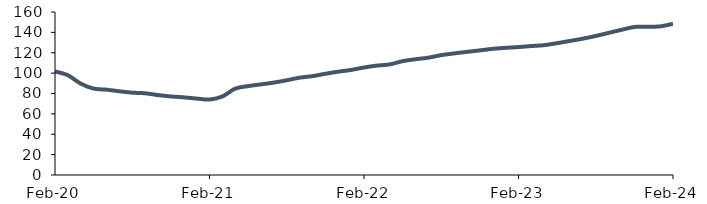
| Category | Series 0 |
|---|---|
| 2020-02-01 | 101.62 |
| 2020-03-01 | 97.938 |
| 2020-04-01 | 89.65 |
| 2020-05-01 | 84.839 |
| 2020-06-01 | 83.781 |
| 2020-07-01 | 82.182 |
| 2020-08-01 | 80.808 |
| 2020-09-01 | 80.198 |
| 2020-10-01 | 78.439 |
| 2020-11-01 | 77.102 |
| 2020-12-01 | 76.237 |
| 2021-01-01 | 75.045 |
| 2021-02-01 | 74.096 |
| 2021-03-01 | 77.079 |
| 2021-04-01 | 84.788 |
| 2021-05-01 | 87.267 |
| 2021-06-01 | 88.947 |
| 2021-07-01 | 90.706 |
| 2021-08-01 | 93 |
| 2021-09-01 | 95.533 |
| 2021-10-01 | 97.064 |
| 2021-11-01 | 99.379 |
| 2021-12-01 | 101.416 |
| 2022-01-01 | 103.119 |
| 2022-02-01 | 105.529 |
| 2022-03-01 | 107.371 |
| 2022-04-01 | 108.553 |
| 2022-05-01 | 111.761 |
| 2022-06-01 | 113.626 |
| 2022-07-01 | 115.177 |
| 2022-08-01 | 117.668 |
| 2022-09-01 | 119.358 |
| 2022-10-01 | 120.89 |
| 2022-11-01 | 122.346 |
| 2022-12-01 | 123.861 |
| 2023-01-01 | 124.823 |
| 2023-02-01 | 125.58 |
| 2023-03-01 | 126.574 |
| 2023-04-01 | 127.453 |
| 2023-05-01 | 129.424 |
| 2023-06-01 | 131.612 |
| 2023-07-01 | 133.833 |
| 2023-08-01 | 136.462 |
| 2023-09-01 | 139.531 |
| 2023-10-01 | 142.523 |
| 2023-11-01 | 145.297 |
| 2023-12-01 | 145.546 |
| 2024-01-01 | 145.879 |
| 2024-02-01 | 148.45 |